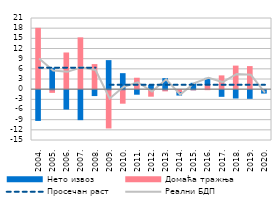
| Category | Домаћа тражњa | Нето извоз |
|---|---|---|
| 2004. | 18.107 | -9.078 |
| 2005. | -0.796 | 6.327 |
| 2006. | 10.824 | -5.716 |
| 2007. | 15.288 | -8.849 |
| 2008. | 7.398 | -1.742 |
| 2009. | -11.301 | 8.569 |
| 2010. | -3.992 | 4.723 |
| 2011. | 3.374 | -1.338 |
| 2012. | -1.923 | 1.242 |
| 2013. | -0.357 | 3.249 |
| 2014. | -0.864 | -0.725 |
| 2015. | -0.072 | 1.878 |
| 2016. | 1.583 | 1.755 |
| 2017. | 4.068 | -1.966 |
| 2018. | 6.95 | -2.455 |
| 2019. | 6.808 | -2.559 |
| 2020. | 0 | -1 |